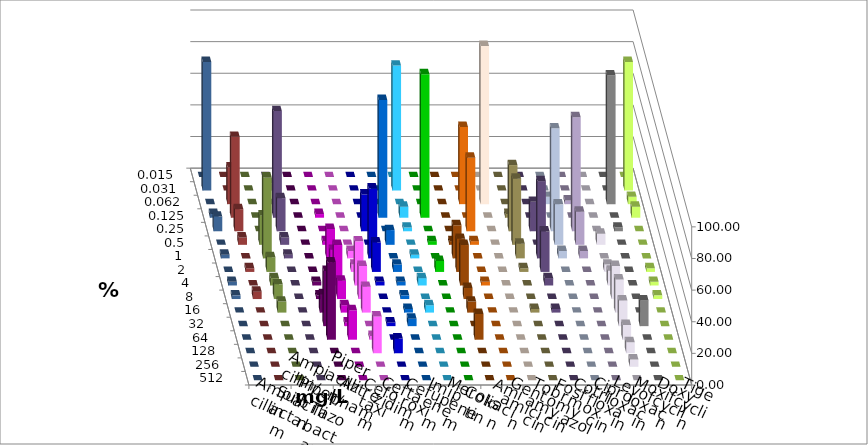
| Category | Ampicillin | Ampicillin/ Sulbactam | Piperacillin | Piperacillin/ Tazobactam | Aztreonam | Cefotaxim | Ceftazidim | Cefuroxim | Imipenem | Meropenem | Colistin | Amikacin | Gentamicin | Tobramycin | Fosfomycin | Cotrimoxazol | Ciprofloxacin | Levofloxacin | Moxifloxacin | Doxycyclin | Tigecyclin |
|---|---|---|---|---|---|---|---|---|---|---|---|---|---|---|---|---|---|---|---|---|---|
| 0.015 | 0 | 0 | 0 | 0 | 0 | 0 | 0 | 0 | 0 | 0 | 0 | 0 | 0 | 0 | 0 | 0 | 0 | 0 | 0 | 0 | 0 |
| 0.031 | 0 | 0 | 0 | 0 | 0 | 79.07 | 0 | 0 | 0 | 0 | 0 | 0 | 0 | 0 | 0 | 0 | 81.395 | 81.395 | 0 | 0 | 4.651 |
| 0.062 | 0 | 0 | 0 | 0 | 0 | 0 | 0 | 0 | 48.837 | 100 | 0 | 0 | 4.651 | 2.326 | 0 | 81.395 | 4.651 | 0 | 23.256 | 0 | 0 |
| 0.125 | 0 | 2.326 | 0 | 0 | 74.419 | 6.977 | 90.698 | 0 | 0 | 0 | 2.326 | 0 | 0 | 0 | 0 | 0 | 6.977 | 2.326 | 51.163 | 0 | 67.442 |
| 0.25 | 0 | 0 | 0 | 23.256 | 0 | 2.326 | 0 | 0 | 46.512 | 0 | 41.86 | 18.605 | 65.116 | 72.093 | 0 | 2.326 | 0 | 9.302 | 13.953 | 0 | 20.93 |
| 0.5 | 0 | 2.326 | 0 | 0 | 9.302 | 0 | 2.326 | 2.326 | 2.326 | 0 | 41.86 | 0 | 25.581 | 20.93 | 6.977 | 0 | 0 | 0 | 4.651 | 18.605 | 4.651 |
| 1.0 | 0 | 18.605 | 4.651 | 44.186 | 0 | 2.326 | 0 | 20.93 | 0 | 0 | 9.302 | 48.837 | 4.651 | 4.651 | 0 | 0 | 0 | 2.326 | 0 | 51.163 | 2.326 |
| 2.0 | 0 | 13.953 | 4.651 | 18.605 | 4.651 | 0 | 6.977 | 20.93 | 0 | 0 | 2.326 | 25.581 | 0 | 0 | 4.651 | 0 | 2.326 | 0 | 2.326 | 9.302 | 0 |
| 4.0 | 2.326 | 25.581 | 27.907 | 2.326 | 2.326 | 4.651 | 0 | 25.581 | 2.326 | 0 | 0 | 4.651 | 0 | 0 | 9.302 | 0 | 2.326 | 2.326 | 0 | 4.651 | 0 |
| 8.0 | 2.326 | 11.628 | 20.93 | 0 | 2.326 | 0 | 0 | 6.977 | 0 | 0 | 0 | 0 | 0 | 0 | 20.93 | 0 | 2.326 | 2.326 | 4.651 | 9.302 | 0 |
| 16.0 | 11.628 | 4.651 | 16.279 | 0 | 2.326 | 4.651 | 0 | 6.977 | 0 | 0 | 2.326 | 2.326 | 0 | 0 | 20.93 | 0 | 0 | 0 | 0 | 6.977 | 0 |
| 32.0 | 34.884 | 2.326 | 0 | 2.326 | 4.651 | 0 | 0 | 0 | 0 | 0 | 0 | 0 | 0 | 0 | 16.279 | 16.279 | 0 | 0 | 0 | 0 | 0 |
| 64.0 | 48.837 | 18.605 | 2.326 | 0 | 0 | 0 | 0 | 16.279 | 0 | 0 | 0 | 0 | 0 | 0 | 9.302 | 0 | 0 | 0 | 0 | 0 | 0 |
| 128.0 | 0 | 0 | 23.256 | 9.302 | 0 | 0 | 0 | 0 | 0 | 0 | 0 | 0 | 0 | 0 | 6.977 | 0 | 0 | 0 | 0 | 0 | 0 |
| 256.0 | 0 | 0 | 0 | 0 | 0 | 0 | 0 | 0 | 0 | 0 | 0 | 0 | 0 | 0 | 4.651 | 0 | 0 | 0 | 0 | 0 | 0 |
| 512.0 | 0 | 0 | 0 | 0 | 0 | 0 | 0 | 0 | 0 | 0 | 0 | 0 | 0 | 0 | 0 | 0 | 0 | 0 | 0 | 0 | 0 |